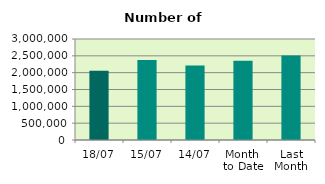
| Category | Series 0 |
|---|---|
| 18/07 | 2056428 |
| 15/07 | 2374626 |
| 14/07 | 2213580 |
| Month 
to Date | 2354688 |
| Last
Month | 2507488.545 |